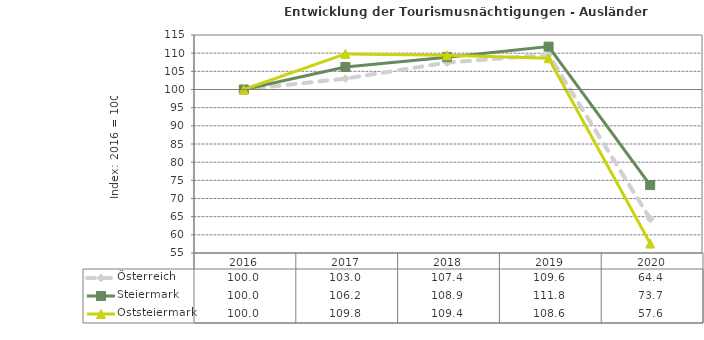
| Category | Österreich | Steiermark | Oststeiermark |
|---|---|---|---|
| 2020.0 | 64.4 | 73.7 | 57.6 |
| 2019.0 | 109.6 | 111.8 | 108.6 |
| 2018.0 | 107.4 | 108.9 | 109.4 |
| 2017.0 | 103 | 106.2 | 109.8 |
| 2016.0 | 100 | 100 | 100 |